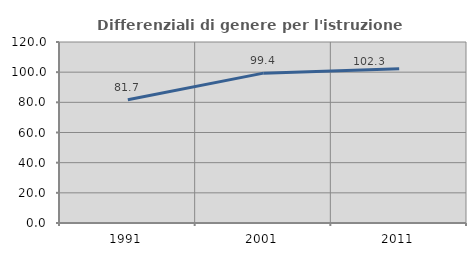
| Category | Differenziali di genere per l'istruzione superiore |
|---|---|
| 1991.0 | 81.675 |
| 2001.0 | 99.351 |
| 2011.0 | 102.298 |